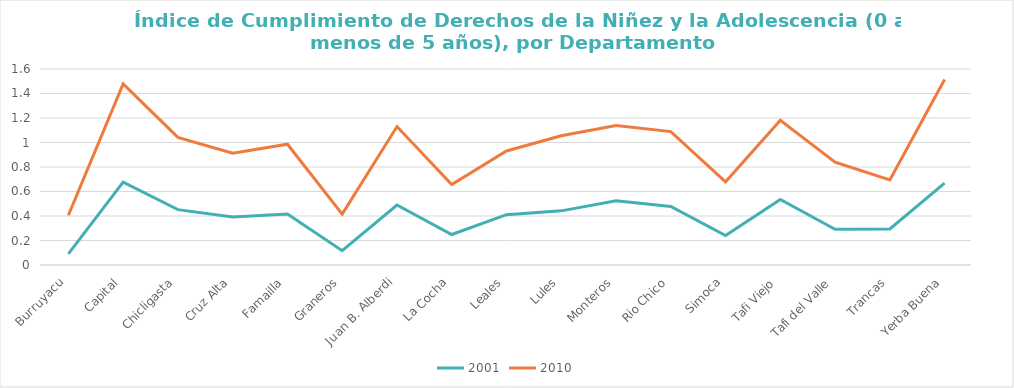
| Category | 2001 | 2010 |
|---|---|---|
| Burruyacu | 0.091 | 0.315 |
| Capital | 0.676 | 0.802 |
| Chicligasta | 0.452 | 0.59 |
| Cruz Alta | 0.391 | 0.522 |
| Famailla | 0.417 | 0.569 |
| Graneros | 0.117 | 0.298 |
| Juan B. Alberdi | 0.49 | 0.64 |
| La Cocha | 0.249 | 0.407 |
| Leales | 0.411 | 0.52 |
| Lules | 0.442 | 0.613 |
| Monteros | 0.524 | 0.614 |
| Rio Chico | 0.478 | 0.611 |
| Simoca | 0.24 | 0.439 |
| Tafi Viejo | 0.535 | 0.646 |
| Tafi del Valle | 0.291 | 0.549 |
| Trancas | 0.294 | 0.4 |
| Yerba Buena | 0.669 | 0.846 |